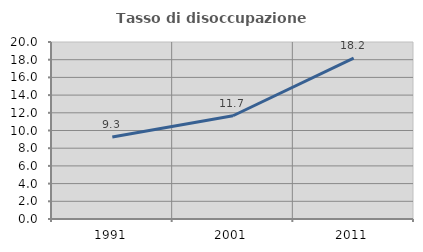
| Category | Tasso di disoccupazione giovanile  |
|---|---|
| 1991.0 | 9.259 |
| 2001.0 | 11.667 |
| 2011.0 | 18.182 |